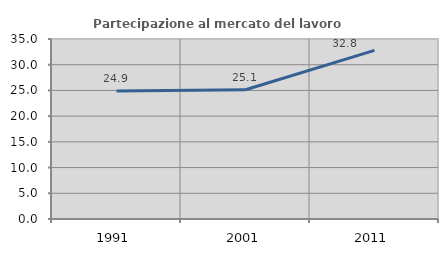
| Category | Partecipazione al mercato del lavoro  femminile |
|---|---|
| 1991.0 | 24.884 |
| 2001.0 | 25.13 |
| 2011.0 | 32.782 |